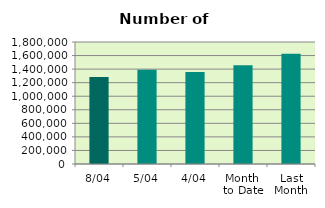
| Category | Series 0 |
|---|---|
| 8/04 | 1283012 |
| 5/04 | 1390066 |
| 4/04 | 1358842 |
| Month 
to Date | 1457752 |
| Last
Month | 1624932.286 |